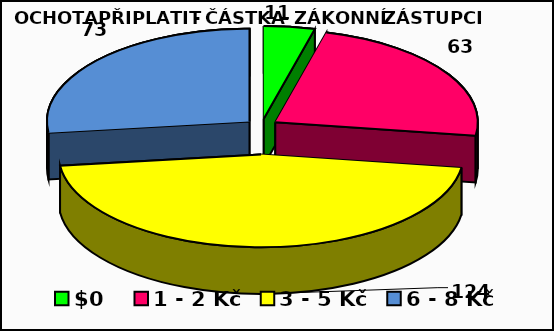
| Category | Series 0 |
|---|---|
| 0 Kč | 11 |
| 1 - 2 Kč | 63 |
| 3 - 5 Kč | 124 |
| 6 - 8 Kč | 73 |